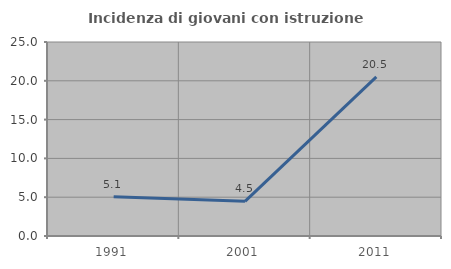
| Category | Incidenza di giovani con istruzione universitaria |
|---|---|
| 1991.0 | 5.063 |
| 2001.0 | 4.464 |
| 2011.0 | 20.513 |